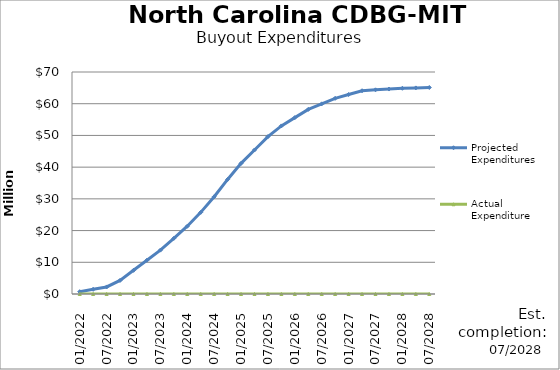
| Category | Projected Expenditures | Actual Expenditure |
|---|---|---|
| 01/2022 | 725000 | 0 |
| 04/2022 | 1475000 | 0 |
| 07/2022 | 2225000 | 0 |
| 10/2022 | 4285000 | 0 |
| 01/2023 | 7467700 | 0 |
| 04/2023 | 10650400 | 0 |
| 07/2023 | 13833100 | 0 |
| 10/2023 | 17546250 | 0 |
| 01/2024 | 21370794.5 | 0 |
| 04/2024 | 25741702.5 | 0 |
| 07/2024 | 30658974 | 0 |
| 10/2024 | 36122609 | 0 |
| 01/2025 | 41187398.645 | 0 |
| 04/2025 | 45408056.682 | 0 |
| 07/2025 | 49628714.72 | 0 |
| 10/2025 | 53005241.15 | 0 |
| 01/2026 | 55613607.817 | 0 |
| 04/2026 | 58221974.484 | 0 |
| 07/2026 | 59960885.596 | 0 |
| 10/2026 | 61699796.707 | 0 |
| 01/2027 | 62893849.004 | 0 |
| 04/2027 | 64087901.3 | 0 |
| 07/2027 | 64386414.374 | 0 |
| 10/2027 | 64625224.834 | 0 |
| 01/2028 | 64864035.293 | 0 |
| 04/2028 | 64983440.523 | 0 |
| 07/2028 | 65117399.752 | 0 |